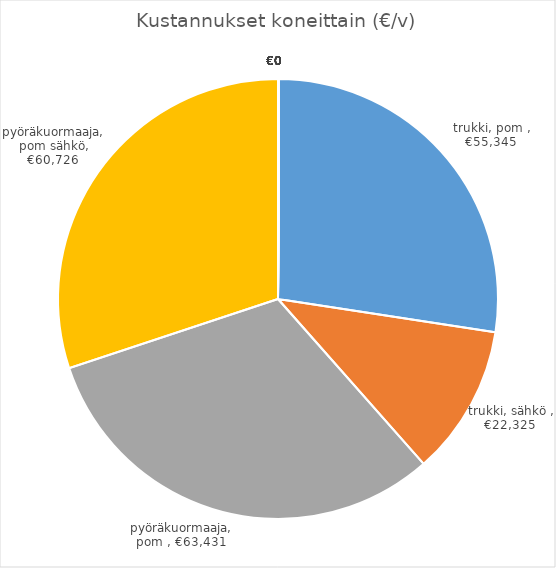
| Category | Kustannukset koneittain |
|---|---|
| trukki, pom  | 55345.029 |
| trukki, sähkö  | 22324.81 |
| pyöräkuormaaja, pom  | 63430.944 |
| pyöräkuormaaja, pom sähkö | 60725.669 |